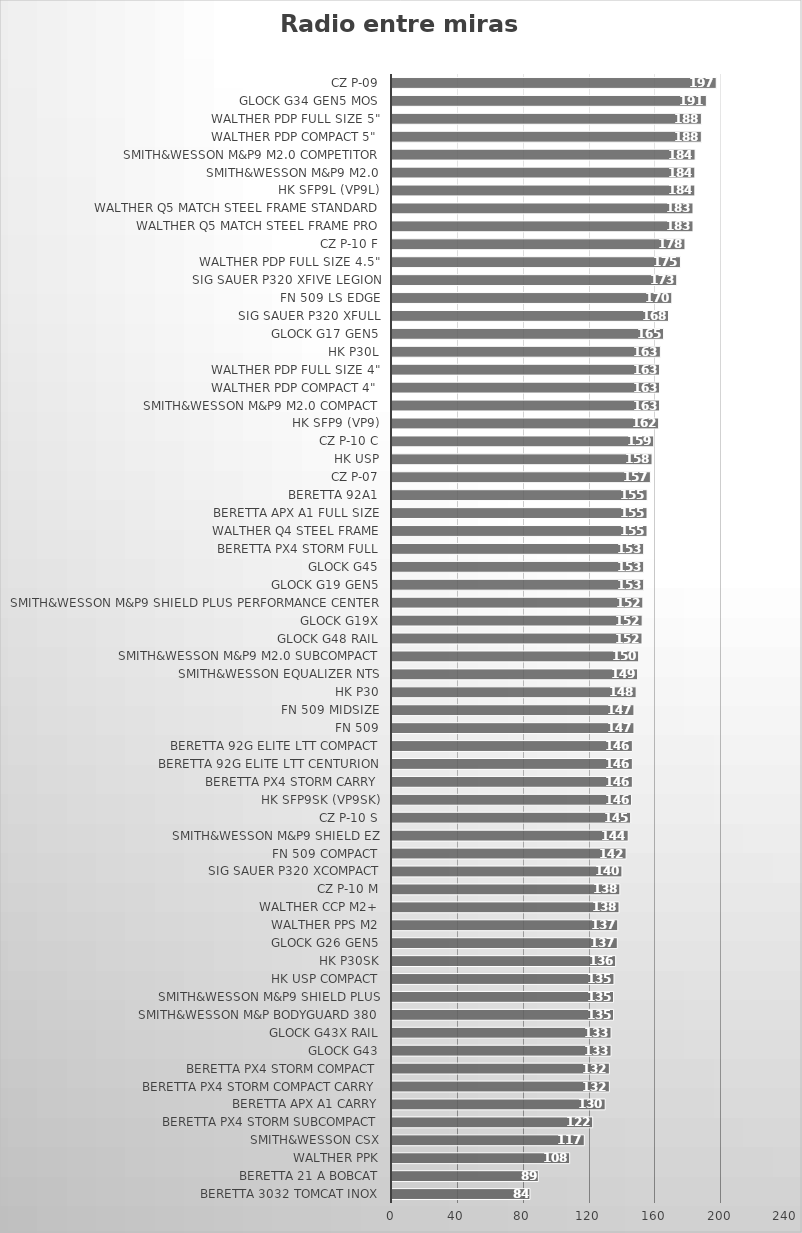
| Category | Radio entre miras 
(mm) |
|---|---|
| Beretta 3032 Tomcat Inox | 83.82 |
| Beretta 21 A Bobcat | 88.9 |
| Walther PPK | 107.95 |
| Smith&Wesson CSX | 116.84 |
| Beretta Px4 Storm SubCompact | 121.92 |
| Beretta APX A1 Carry | 129.54 |
| Beretta Px4 Storm Compact Carry | 132.08 |
| Beretta Px4 Storm Compact | 132.08 |
| Glock G43 | 133.096 |
| Glock G43X Rail | 133.096 |
| Smith&Wesson M&P Bodyguard 380 | 134.62 |
| Smith&Wesson M&P9 Shield Plus | 134.62 |
| HK USP Compact | 134.874 |
| HK P30SK | 135.89 |
| Glock G26 Gen5 | 136.906 |
| Walther PPS M2 | 137.16 |
| Walther CCP M2+ | 137.922 |
| CZ P-10 M | 138.43 |
| SIG Sauer P320 XCOMPACT | 139.7 |
| FN 509 Compact | 142.24 |
| Smith&Wesson M&P9 Shield EZ | 143.51 |
| CZ P-10 S | 145 |
| HK SFP9SK (VP9SK) | 145.542 |
| Beretta Px4 Storm Carry | 146.05 |
| Beretta 92G Elite LTT Centurion | 146.05 |
| Beretta 92G Elite LTT Compact | 146.05 |
| FN 509 | 147 |
| FN 509 Midsize | 147 |
| HK P30 | 148.336 |
| Smith&Wesson Equalizer NTS | 149.225 |
| Smith&Wesson M&P9 M2.0 Subcompact | 149.86 |
| Glock G48 Rail | 151.892 |
| Glock G19X | 152 |
| Smith&Wesson M&P9 Shield Plus Performance Center | 152.4 |
| Glock G19 Gen5 | 152.908 |
| Glock G45 | 152.908 |
| Beretta Px4 Storm Full | 152.908 |
| Walther Q4 Steel Frame | 154.94 |
| Beretta APX A1 Full Size | 154.94 |
| Beretta 92A1 | 155 |
| CZ P-07 | 157 |
| HK USP | 157.988 |
| CZ P-10 C | 159 |
| HK SFP9 (VP9) | 162 |
| Smith&Wesson M&P9 M2.0 Compact | 162.56 |
| Walther PDP Compact 4" | 162.56 |
| Walther PDP Full Size 4" | 162.56 |
| HK P30L | 163.068 |
| Glock G17 Gen5 | 165 |
| SIG Sauer P320 XFULL | 168 |
| FN 509 LS Edge | 170 |
| SIG Sauer P320 XFIVE Legion | 173 |
| Walther PDP Full Size 4.5" | 175.26 |
| CZ P-10 F | 178 |
| Walther Q5 Match Steel Frame Pro | 182.88 |
| Walther Q5 Match Steel Frame Standard | 182.88 |
| HK SFP9L (VP9L) | 184 |
| Smith&Wesson M&P9 M2.0 | 184 |
| Smith&Wesson M&P9 M2.0 Competitor | 184.15 |
| Walther PDP Compact 5" | 187.96 |
| Walther PDP Full Size 5" | 188 |
| Glock G34 Gen5 MOS | 191.008 |
| CZ P-09 | 197 |